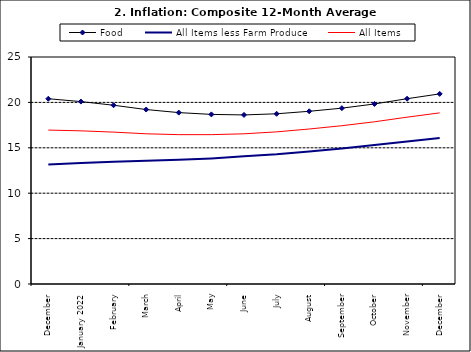
| Category | Food | All Items less Farm Produce | All Items |
|---|---|---|---|
| December | 20.403 | 13.161 | 16.953 |
| January 2022 | 20.089 | 13.326 | 16.869 |
| February | 19.687 | 13.461 | 16.728 |
| March | 19.214 | 13.562 | 16.544 |
| April | 18.876 | 13.681 | 16.449 |
| May | 18.679 | 13.83 | 16.449 |
| June | 18.619 | 14.057 | 16.542 |
| July | 18.745 | 14.278 | 16.755 |
| August | 19.021 | 14.603 | 17.07 |
| September | 19.365 | 14.934 | 17.432 |
| October | 19.829 | 15.315 | 17.865 |
| November | 20.407 | 15.687 | 18.372 |
| December | 20.937 | 16.075 | 18.847 |